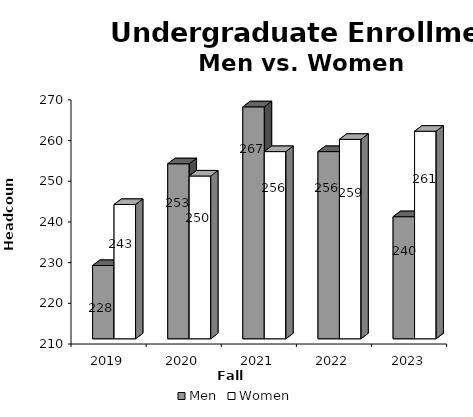
| Category | Men | Women |
|---|---|---|
| 2019.0 | 228 | 243 |
| 2020.0 | 253 | 250 |
| 2021.0 | 267 | 256 |
| 2022.0 | 256 | 259 |
| 2023.0 | 240 | 261 |